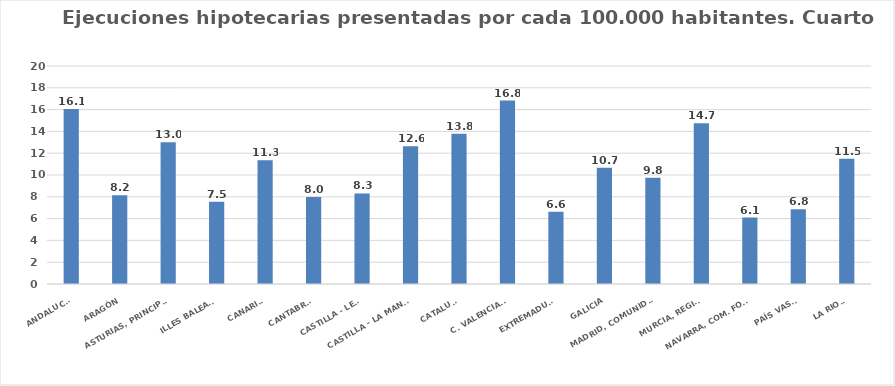
| Category | Series 0 |
|---|---|
| ANDALUCÍA | 16.066 |
| ARAGÓN | 8.152 |
| ASTURIAS, PRINCIPADO | 13.014 |
| ILLES BALEARS | 7.541 |
| CANARIAS | 11.343 |
| CANTABRIA | 7.986 |
| CASTILLA - LEÓN | 8.31 |
| CASTILLA - LA MANCHA | 12.64 |
| CATALUÑA | 13.774 |
| C. VALENCIANA | 16.826 |
| EXTREMADURA | 6.639 |
| GALICIA | 10.668 |
| MADRID, COMUNIDAD | 9.753 |
| MURCIA, REGIÓN | 14.749 |
| NAVARRA, COM. FORAL | 6.099 |
| PAÍS VASCO | 6.847 |
| LA RIOJA | 11.481 |